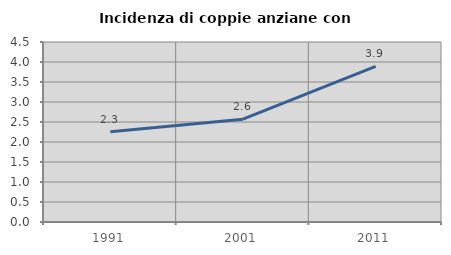
| Category | Incidenza di coppie anziane con figli |
|---|---|
| 1991.0 | 2.255 |
| 2001.0 | 2.571 |
| 2011.0 | 3.893 |